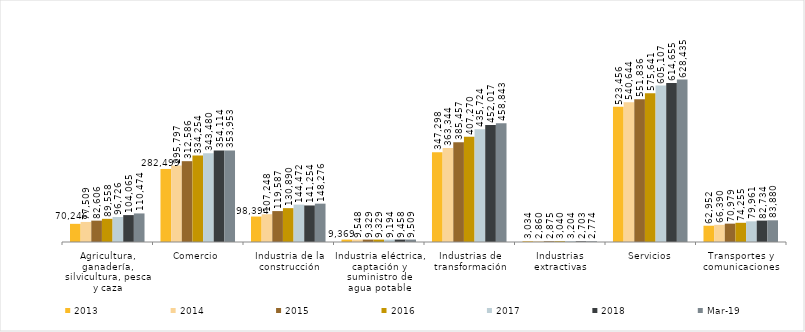
| Category | 2013 | 2014 | 2015 | 2016 | 2017 | 2018 | mar-19 |
|---|---|---|---|---|---|---|---|
| Agricultura, ganadería, silvicultura, pesca y caza | 70246 | 77509 | 82606 | 89558 | 96726 | 104065 | 110474 |
| Comercio | 282499 | 295797 | 312586 | 334254 | 343480 | 354114 | 353953 |
| Industria de la construcción | 98394 | 107248 | 119587 | 130890 | 144472 | 141254 | 148276 |
| Industria eléctrica, captación y suministro de agua potable | 9369 | 9548 | 9329 | 9329 | 9194 | 9458 | 9509 |
| Industrias de transformación | 347298 | 363344 | 385457 | 407270 | 435724 | 452017 | 458843 |
| Industrias extractivas | 3034 | 2860 | 2875 | 3040 | 3204 | 2703 | 2774 |
| Servicios | 523456 | 540644 | 551836 | 575641 | 605107 | 614655 | 628435 |
| Transportes y comunicaciones | 62952 | 66390 | 70979 | 74255 | 79961 | 82734 | 83880 |